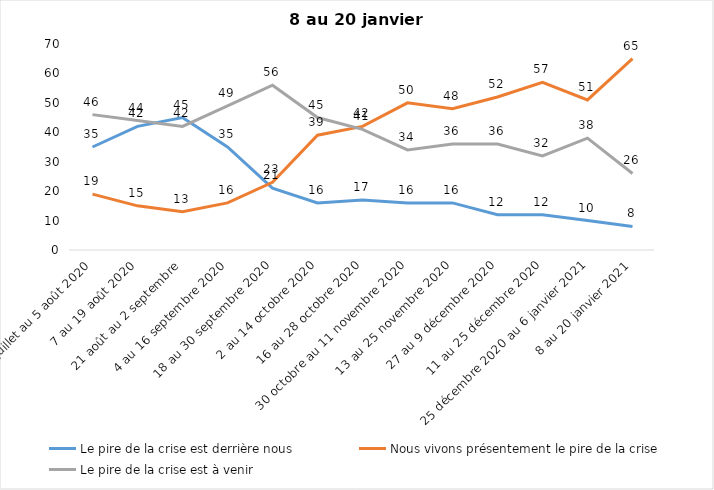
| Category | Le pire de la crise est derrière nous | Nous vivons présentement le pire de la crise | Le pire de la crise est à venir |
|---|---|---|---|
| 24 juillet au 5 août 2020 | 35 | 19 | 46 |
| 7 au 19 août 2020 | 42 | 15 | 44 |
| 21 août au 2 septembre | 45 | 13 | 42 |
| 4 au 16 septembre 2020 | 35 | 16 | 49 |
| 18 au 30 septembre 2020 | 21 | 23 | 56 |
| 2 au 14 octobre 2020 | 16 | 39 | 45 |
| 16 au 28 octobre 2020 | 17 | 42 | 41 |
| 30 octobre au 11 novembre 2020 | 16 | 50 | 34 |
| 13 au 25 novembre 2020 | 16 | 48 | 36 |
| 27 au 9 décembre 2020 | 12 | 52 | 36 |
| 11 au 25 décembre 2020 | 12 | 57 | 32 |
| 25 décembre 2020 au 6 janvier 2021 | 10 | 51 | 38 |
| 8 au 20 janvier 2021 | 8 | 65 | 26 |